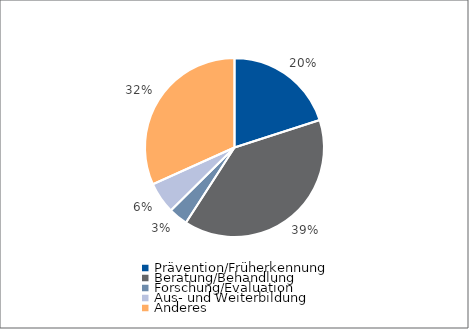
| Category | Series 0 |
|---|---|
| Prävention/Früherkennung | 20929 |
| Beratung/Behandlung | 40816 |
| Forschung/Evaluation | 3608 |
| Aus- und Weiterbildung | 5936 |
| Anderes | 33132 |